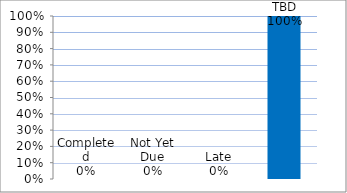
| Category | Series 0 |
|---|---|
| Completed | 0 |
| Not Yet Due | 0 |
| Late | 0 |
| TBD | 1 |